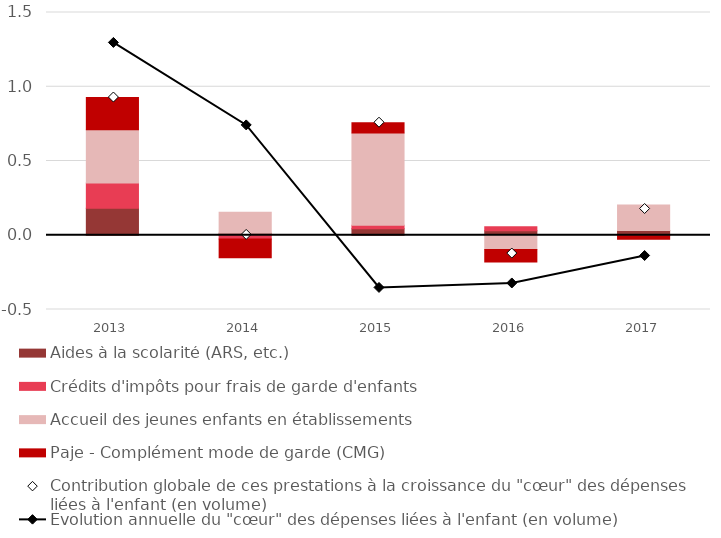
| Category | Aides à la scolarité (ARS, etc.) | Crédits d'impôts pour frais de garde d'enfants  | Accueil des jeunes enfants en établissements | Paje - Complément mode de garde (CMG) |
|---|---|---|---|---|
| 2013.0 | 0.182 | 0.17 | 0.359 | 0.217 |
| 2014.0 | 0.014 | -0.026 | 0.141 | -0.126 |
| 2015.0 | 0.044 | 0.023 | 0.622 | 0.069 |
| 2016.0 | 0.03 | 0.027 | -0.095 | -0.085 |
| 2017.0 | 0.033 | -0.004 | 0.172 | -0.024 |